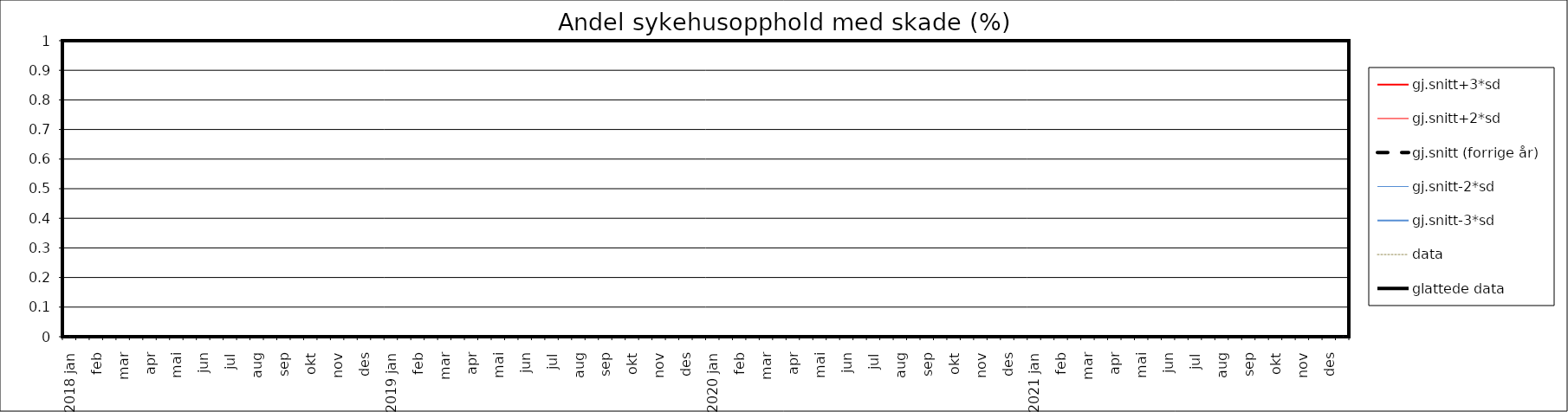
| Category | gj.snitt+3*sd | gj.snitt+2*sd | gj.snitt (forrige år) | gj.snitt-2*sd | gj.snitt-3*sd | data | glattede data |
|---|---|---|---|---|---|---|---|
| 2018 jan | 0 | 0 | 0 | 0 | 0 | 0 | 0 |
|  | 0 | 0 | 0 | 0 | 0 | 0 | 0 |
| feb | 0 | 0 | 0 | 0 | 0 | 0 | 0 |
|  | 0 | 0 | 0 | 0 | 0 | 0 | 0 |
| mar | 0 | 0 | 0 | 0 | 0 | 0 | 0 |
|  | 0 | 0 | 0 | 0 | 0 | 0 | 0 |
| apr | 0 | 0 | 0 | 0 | 0 | 0 | 0 |
|  | 0 | 0 | 0 | 0 | 0 | 0 | 0 |
| mai | 0 | 0 | 0 | 0 | 0 | 0 | 0 |
|  | 0 | 0 | 0 | 0 | 0 | 0 | 0 |
| jun | 0 | 0 | 0 | 0 | 0 | 0 | 0 |
|  | 0 | 0 | 0 | 0 | 0 | 0 | 0 |
| jul | 0 | 0 | 0 | 0 | 0 | 0 | 0 |
|  | 0 | 0 | 0 | 0 | 0 | 0 | 0 |
| aug | 0 | 0 | 0 | 0 | 0 | 0 | 0 |
|  | 0 | 0 | 0 | 0 | 0 | 0 | 0 |
| sep | 0 | 0 | 0 | 0 | 0 | 0 | 0 |
|  | 0 | 0 | 0 | 0 | 0 | 0 | 0 |
| okt | 0 | 0 | 0 | 0 | 0 | 0 | 0 |
|  | 0 | 0 | 0 | 0 | 0 | 0 | 0 |
| nov | 0 | 0 | 0 | 0 | 0 | 0 | 0 |
|  | 0 | 0 | 0 | 0 | 0 | 0 | 0 |
| des | 0 | 0 | 0 | 0 | 0 | 0 | 0 |
|  | 0 | 0 | 0 | 0 | 0 | 0 | 0 |
| 2019 jan | 0 | 0 | 0 | 0 | 0 | 0 | 0 |
|  | 0 | 0 | 0 | 0 | 0 | 0 | 0 |
| feb | 0 | 0 | 0 | 0 | 0 | 0 | 0 |
|  | 0 | 0 | 0 | 0 | 0 | 0 | 0 |
| mar | 0 | 0 | 0 | 0 | 0 | 0 | 0 |
|  | 0 | 0 | 0 | 0 | 0 | 0 | 0 |
| apr | 0 | 0 | 0 | 0 | 0 | 0 | 0 |
|  | 0 | 0 | 0 | 0 | 0 | 0 | 0 |
| mai | 0 | 0 | 0 | 0 | 0 | 0 | 0 |
|  | 0 | 0 | 0 | 0 | 0 | 0 | 0 |
| jun | 0 | 0 | 0 | 0 | 0 | 0 | 0 |
|  | 0 | 0 | 0 | 0 | 0 | 0 | 0 |
| jul | 0 | 0 | 0 | 0 | 0 | 0 | 0 |
|  | 0 | 0 | 0 | 0 | 0 | 0 | 0 |
| aug | 0 | 0 | 0 | 0 | 0 | 0 | 0 |
|  | 0 | 0 | 0 | 0 | 0 | 0 | 0 |
| sep | 0 | 0 | 0 | 0 | 0 | 0 | 0 |
|  | 0 | 0 | 0 | 0 | 0 | 0 | 0 |
| okt | 0 | 0 | 0 | 0 | 0 | 0 | 0 |
|  | 0 | 0 | 0 | 0 | 0 | 0 | 0 |
| nov | 0 | 0 | 0 | 0 | 0 | 0 | 0 |
|  | 0 | 0 | 0 | 0 | 0 | 0 | 0 |
| des | 0 | 0 | 0 | 0 | 0 | 0 | 0 |
|  | 0 | 0 | 0 | 0 | 0 | 0 | 0 |
| 2020 jan | 0 | 0 | 0 | 0 | 0 | 0 | 0 |
|  | 0 | 0 | 0 | 0 | 0 | 0 | 0 |
| feb | 0 | 0 | 0 | 0 | 0 | 0 | 0 |
|  | 0 | 0 | 0 | 0 | 0 | 0 | 0 |
| mar | 0 | 0 | 0 | 0 | 0 | 0 | 0 |
|  | 0 | 0 | 0 | 0 | 0 | 0 | 0 |
| apr | 0 | 0 | 0 | 0 | 0 | 0 | 0 |
|  | 0 | 0 | 0 | 0 | 0 | 0 | 0 |
| mai | 0 | 0 | 0 | 0 | 0 | 0 | 0 |
|  | 0 | 0 | 0 | 0 | 0 | 0 | 0 |
| jun | 0 | 0 | 0 | 0 | 0 | 0 | 0 |
|  | 0 | 0 | 0 | 0 | 0 | 0 | 0 |
| jul | 0 | 0 | 0 | 0 | 0 | 0 | 0 |
|  | 0 | 0 | 0 | 0 | 0 | 0 | 0 |
| aug | 0 | 0 | 0 | 0 | 0 | 0 | 0 |
|  | 0 | 0 | 0 | 0 | 0 | 0 | 0 |
| sep | 0 | 0 | 0 | 0 | 0 | 0 | 0 |
|  | 0 | 0 | 0 | 0 | 0 | 0 | 0 |
| okt | 0 | 0 | 0 | 0 | 0 | 0 | 0 |
|  | 0 | 0 | 0 | 0 | 0 | 0 | 0 |
| nov | 0 | 0 | 0 | 0 | 0 | 0 | 0 |
|  | 0 | 0 | 0 | 0 | 0 | 0 | 0 |
| des | 0 | 0 | 0 | 0 | 0 | 0 | 0 |
|  | 0 | 0 | 0 | 0 | 0 | 0 | 0 |
| 2021 jan | 0 | 0 | 0 | 0 | 0 | 0 | 0 |
|  | 0 | 0 | 0 | 0 | 0 | 0 | 0 |
| feb | 0 | 0 | 0 | 0 | 0 | 0 | 0 |
|  | 0 | 0 | 0 | 0 | 0 | 0 | 0 |
| mar | 0 | 0 | 0 | 0 | 0 | 0 | 0 |
|  | 0 | 0 | 0 | 0 | 0 | 0 | 0 |
| apr | 0 | 0 | 0 | 0 | 0 | 0 | 0 |
|  | 0 | 0 | 0 | 0 | 0 | 0 | 0 |
| mai | 0 | 0 | 0 | 0 | 0 | 0 | 0 |
|  | 0 | 0 | 0 | 0 | 0 | 0 | 0 |
| jun | 0 | 0 | 0 | 0 | 0 | 0 | 0 |
|  | 0 | 0 | 0 | 0 | 0 | 0 | 0 |
| jul | 0 | 0 | 0 | 0 | 0 | 0 | 0 |
|  | 0 | 0 | 0 | 0 | 0 | 0 | 0 |
| aug | 0 | 0 | 0 | 0 | 0 | 0 | 0 |
|  | 0 | 0 | 0 | 0 | 0 | 0 | 0 |
| sep | 0 | 0 | 0 | 0 | 0 | 0 | 0 |
|  | 0 | 0 | 0 | 0 | 0 | 0 | 0 |
| okt | 0 | 0 | 0 | 0 | 0 | 0 | 0 |
|  | 0 | 0 | 0 | 0 | 0 | 0 | 0 |
| nov | 0 | 0 | 0 | 0 | 0 | 0 | 0 |
|  | 0 | 0 | 0 | 0 | 0 | 0 | 0 |
| des | 0 | 0 | 0 | 0 | 0 | 0 | 0 |